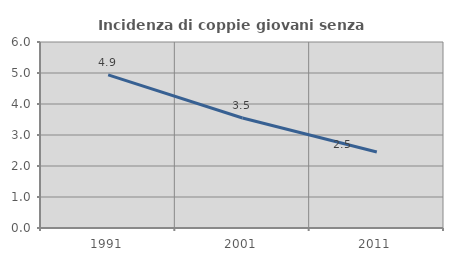
| Category | Incidenza di coppie giovani senza figli |
|---|---|
| 1991.0 | 4.937 |
| 2001.0 | 3.548 |
| 2011.0 | 2.453 |